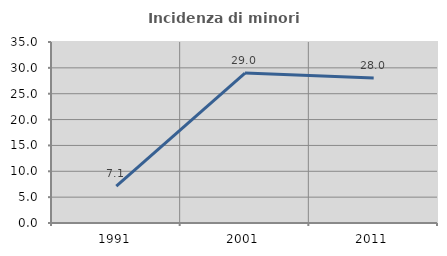
| Category | Incidenza di minori stranieri |
|---|---|
| 1991.0 | 7.143 |
| 2001.0 | 28.986 |
| 2011.0 | 28.03 |